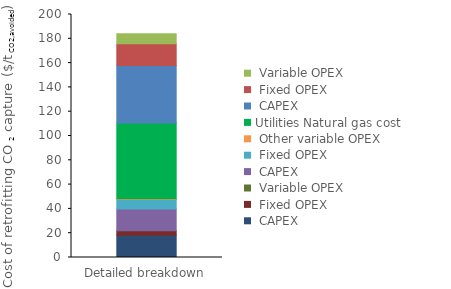
| Category | Interconnecting | Utilities | Series 0 | Series 1 | Series 2 |
|---|---|---|---|---|---|
| 0 | 0 | 62.394 | 47.298 | 17.867 | 8.349 |